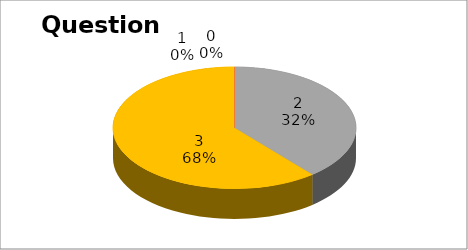
| Category | Series 0 |
|---|---|
| 0 | 0 |
| 1 | 0 |
| 2 | 37 |
| 3 | 58 |